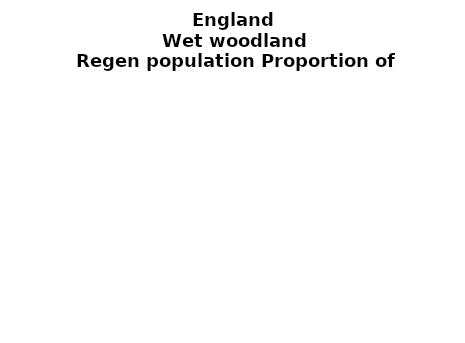
| Category | Wet woodland |
|---|---|
| None | 0.057 |
| Seedlings only | 0 |
| Seedlings, saplings only | 0.008 |
| Seedlings, saplings, <7 cm trees | 0.201 |
| Saplings only | 0.18 |
| <7 cm trees, seedlings only | 0 |
| <7 cm trees, saplings only | 0.491 |
| <7 cm Trees only | 0.063 |